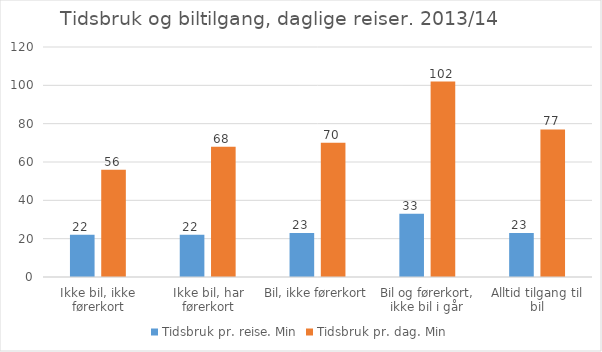
| Category | Tidsbruk pr. reise. Min | Tidsbruk pr. dag. Min |
|---|---|---|
| Ikke bil, ikke førerkort | 22 | 56 |
| Ikke bil, har førerkort | 22 | 68 |
| Bil, ikke førerkort | 23 | 70 |
| Bil og førerkort, ikke bil i går | 33 | 102 |
| Alltid tilgang til bil | 23 | 77 |